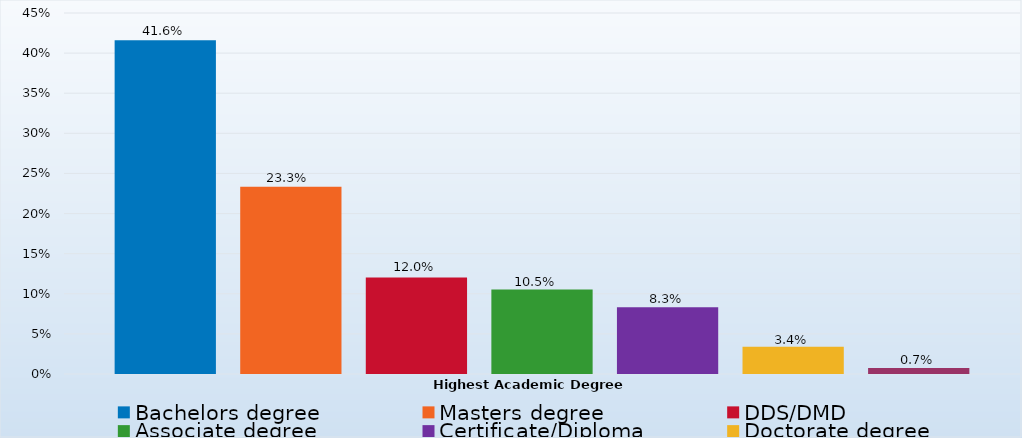
| Category | Bachelors degree | Masters degree | DDS/DMD | Associate degree | Certificate/Diploma | Doctorate degree | Other |
|---|---|---|---|---|---|---|---|
| Percent | 0.416 | 0.233 | 0.12 | 0.105 | 0.083 | 0.034 | 0.007 |